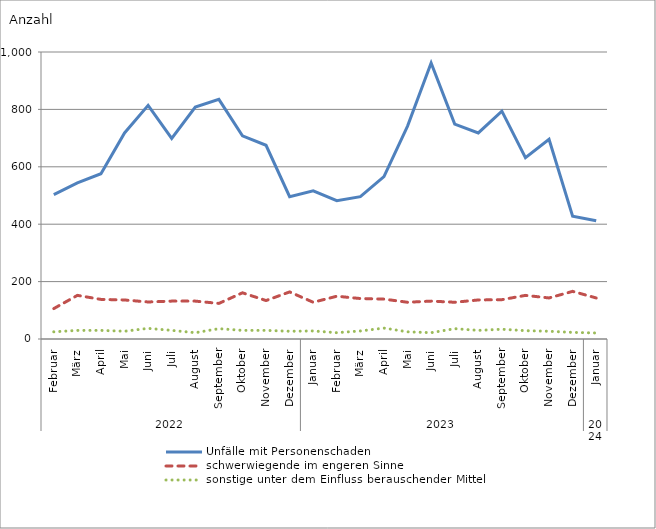
| Category | Unfälle mit Personenschaden | schwerwiegende im engeren Sinne | sonstige unter dem Einfluss berauschender Mittel |
|---|---|---|---|
| 0 | 503 | 106 | 25 |
| 1 | 544 | 152 | 30 |
| 2 | 576 | 138 | 30 |
| 3 | 718 | 136 | 27 |
| 4 | 814 | 129 | 37 |
| 5 | 699 | 132 | 30 |
| 6 | 808 | 132 | 22 |
| 7 | 835 | 124 | 36 |
| 8 | 708 | 161 | 30 |
| 9 | 675 | 134 | 30 |
| 10 | 496 | 164 | 27 |
| 11 | 516 | 128 | 28 |
| 12 | 482 | 149 | 22 |
| 13 | 496 | 141 | 28 |
| 14 | 566 | 139 | 38 |
| 15 | 742 | 128 | 25 |
| 16 | 962 | 132 | 22 |
| 17 | 749 | 128 | 36 |
| 18 | 718 | 136 | 30 |
| 19 | 794 | 137 | 34 |
| 20 | 632 | 152 | 29 |
| 21 | 696 | 143 | 27 |
| 22 | 428 | 166 | 23 |
| 23 | 412 | 143 | 21 |